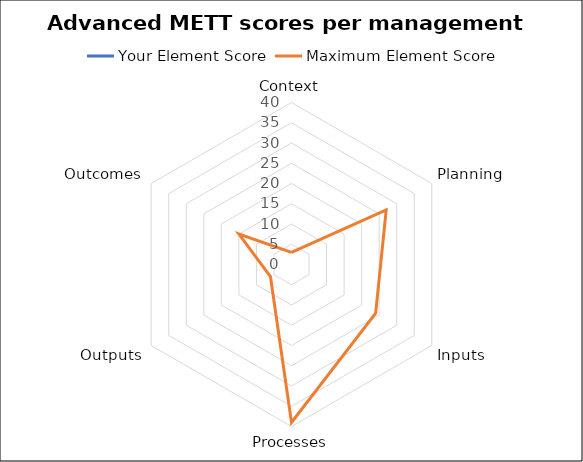
| Category | Your Element Score | Maximum Element Score |
|---|---|---|
| Context | 0 | 3 |
| Planning | 0 | 27 |
| Inputs | 0 | 24 |
| Processes | 0 | 39 |
| Outputs | 0 | 6 |
| Outcomes | 0 | 15 |